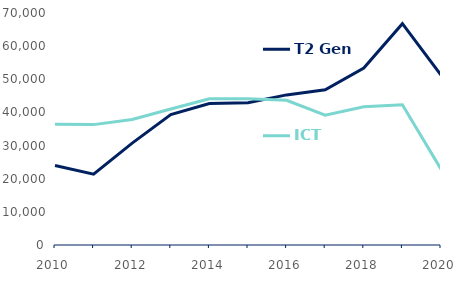
| Category |  T2 Gen  |  ICT  |
|---|---|---|
| 2010.0 | 23989 | 36443 |
| 2011.0 | 21374 | 36321 |
| 2012.0 | 30746 | 37884 |
| 2013.0 | 39364 | 41043 |
| 2014.0 | 42661 | 44090 |
| 2015.0 | 42911 | 44147 |
| 2016.0 | 45291 | 43653 |
| 2017.0 | 46859 | 39162 |
| 2018.0 | 53412 | 41714 |
| 2019.0 | 66788 | 42294 |
| 2020.0 | 51297 | 22895 |